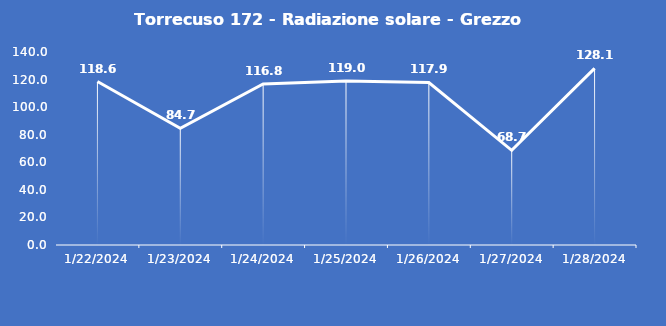
| Category | Torrecuso 172 - Radiazione solare - Grezzo (W/m2) |
|---|---|
| 1/22/24 | 118.6 |
| 1/23/24 | 84.7 |
| 1/24/24 | 116.8 |
| 1/25/24 | 119 |
| 1/26/24 | 117.9 |
| 1/27/24 | 68.7 |
| 1/28/24 | 128.1 |